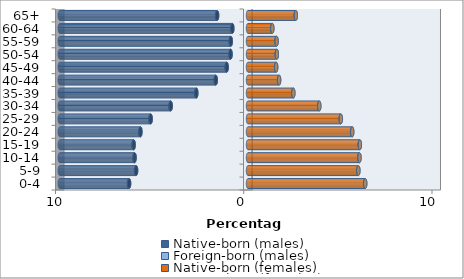
| Category | Native-born (males) | Foreign-born (males) | Native-born (females) | Foreign-born (females) |
|---|---|---|---|---|
| 0-4 | -6.316 | -0.009 | 6.223 | 0.005 |
| 5-9 | -5.943 | -0.008 | 5.859 | 0.004 |
| 10-14 | -6.025 | -0.008 | 5.919 | 0.004 |
| 15-19 | -6.073 | -0.01 | 5.938 | 0.005 |
| 20-24 | -5.714 | -0.011 | 5.532 | 0.006 |
| 25-29 | -5.169 | -0.013 | 4.927 | 0.006 |
| 30-34 | -4.106 | -0.012 | 3.782 | 0.006 |
| 35-39 | -2.745 | -0.01 | 2.404 | 0.005 |
| 40-44 | -1.712 | -0.007 | 1.65 | 0.003 |
| 45-49 | -1.131 | -0.004 | 1.494 | 0.002 |
| 50-54 | -0.925 | -0.002 | 1.53 | 0.001 |
| 55-59 | -0.915 | -0.001 | 1.517 | 0.001 |
| 60-64 | -0.832 | -0.001 | 1.291 | 0.001 |
| 65+ | -1.64 | -0.001 | 2.537 | 0.002 |